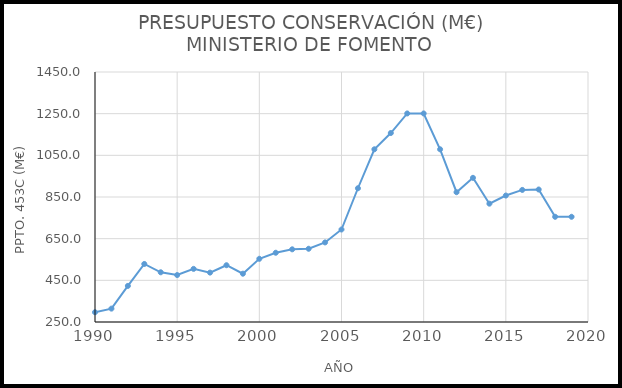
| Category | PRESUPUESTO (M€) |
|---|---|
| 1990.0 | 296.9 |
| 1991.0 | 314.2 |
| 1992.0 | 423.2 |
| 1993.0 | 528.6 |
| 1994.0 | 488.6 |
| 1995.0 | 475.4 |
| 1996.0 | 505 |
| 1997.0 | 487.1 |
| 1998.0 | 522.5 |
| 1999.0 | 481.9 |
| 2000.0 | 553.4 |
| 2001.0 | 582.4 |
| 2002.0 | 598.9 |
| 2003.0 | 601.6 |
| 2004.0 | 632 |
| 2005.0 | 694 |
| 2006.0 | 892 |
| 2007.0 | 1079 |
| 2008.0 | 1157 |
| 2009.0 | 1251 |
| 2010.0 | 1251 |
| 2011.0 | 1079 |
| 2012.0 | 873 |
| 2013.0 | 942 |
| 2014.0 | 818 |
| 2015.0 | 857 |
| 2016.0 | 884 |
| 2017.0 | 886 |
| 2018.0 | 755 |
| 2019.0 | 755 |